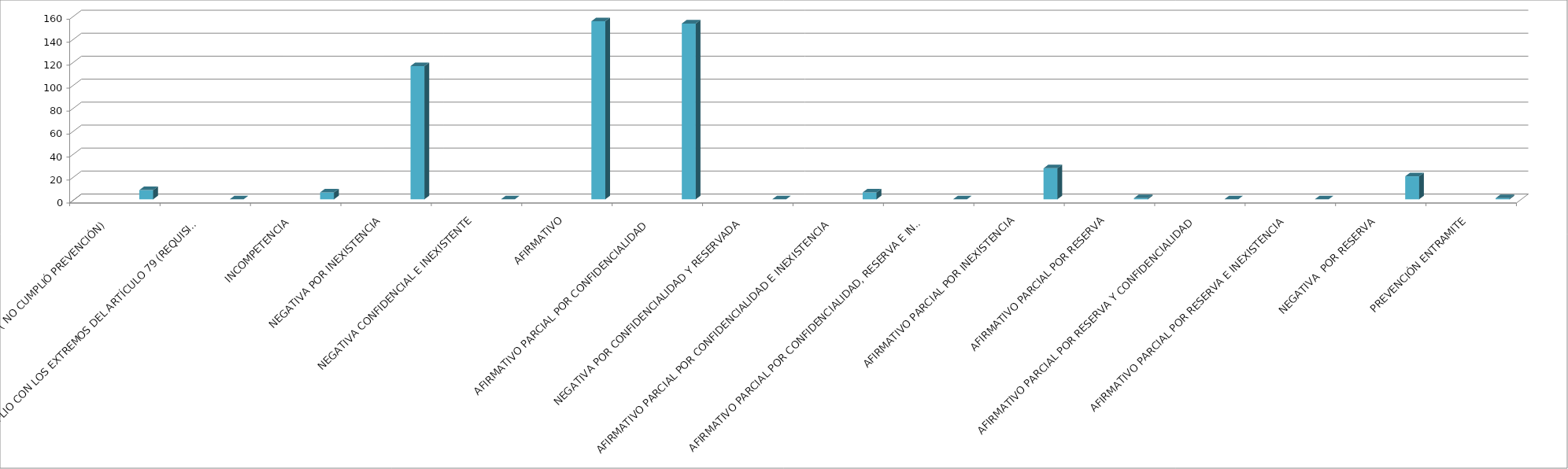
| Category | Series 0 | Series 1 | Series 2 | Series 3 | Series 4 |
|---|---|---|---|---|---|
| SE TIENE POR NO PRESENTADA ( NO CUMPLIÓ PREVENCIÓN) |  |  |  |  | 8 |
| NO CUMPLIO CON LOS EXTREMOS DEL ARTÍCULO 79 (REQUISITOS) |  |  |  |  | 0 |
| INCOMPETENCIA  |  |  |  |  | 6 |
| NEGATIVA POR INEXISTENCIA |  |  |  |  | 116 |
| NEGATIVA CONFIDENCIAL E INEXISTENTE |  |  |  |  | 0 |
| AFIRMATIVO |  |  |  |  | 155 |
| AFIRMATIVO PARCIAL POR CONFIDENCIALIDAD  |  |  |  |  | 153 |
| NEGATIVA POR CONFIDENCIALIDAD Y RESERVADA |  |  |  |  | 0 |
| AFIRMATIVO PARCIAL POR CONFIDENCIALIDAD E INEXISTENCIA |  |  |  |  | 6 |
| AFIRMATIVO PARCIAL POR CONFIDENCIALIDAD, RESERVA E INEXISTENCIA |  |  |  |  | 0 |
| AFIRMATIVO PARCIAL POR INEXISTENCIA |  |  |  |  | 27 |
| AFIRMATIVO PARCIAL POR RESERVA |  |  |  |  | 1 |
| AFIRMATIVO PARCIAL POR RESERVA Y CONFIDENCIALIDAD |  |  |  |  | 0 |
| AFIRMATIVO PARCIAL POR RESERVA E INEXISTENCIA |  |  |  |  | 0 |
| NEGATIVA  POR RESERVA |  |  |  |  | 20 |
| PREVENCIÓN ENTRAMITE |  |  |  |  | 1 |